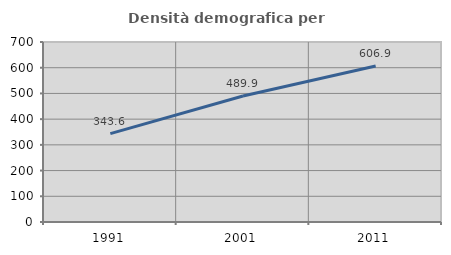
| Category | Densità demografica |
|---|---|
| 1991.0 | 343.631 |
| 2001.0 | 489.927 |
| 2011.0 | 606.901 |